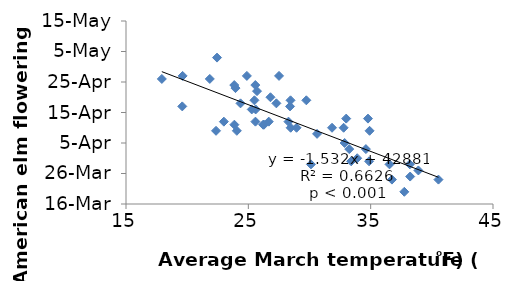
| Category | Series 0 |
|---|---|
| 26.28 | 2017-04-11 |
| 34.61 | 2017-04-03 |
| 22.36 | 2017-04-09 |
| 24.88 | 2017-04-27 |
| 38.23 | 2017-03-25 |
| 40.54 | 2017-03-24 |
| 27.51 | 2017-04-27 |
| 25.58 | 2017-04-12 |
| 28.28 | 2017-04-12 |
| 22.44 | 2017-05-03 |
| 19.63 | 2017-04-27 |
| 24.36 | 2017-04-18 |
| 29.74 | 2017-04-19 |
| 26.67 | 2017-04-12 |
| 24.06 | 2017-04-09 |
| 23.95 | 2017-04-23 |
| 28.45 | 2017-04-19 |
| 30.62 | 2017-04-08 |
| 31.84 | 2017-04-10 |
| 19.6 | 2017-04-17 |
| 33.0 | 2017-04-13 |
| 25.71 | 2017-04-22 |
| 33.9 | 2017-03-31 |
| 25.28 | 2017-04-16 |
| 17.93 | 2017-04-26 |
| 34.78 | 2017-04-13 |
| 28.94 | 2017-04-10 |
| 38.2 | 2017-03-29 |
| 23.0 | 2017-04-12 |
| 23.85 | 2017-04-24 |
| 26.21 | 2017-04-11 |
| 25.57 | 2017-04-24 |
| 38.9 | 2017-03-27 |
| 28.41 | 2017-04-17 |
| 21.85 | 2017-04-26 |
| 30.12 | 2017-03-29 |
| 36.54 | 2017-03-29 |
| 28.46 | 2017-04-10 |
| 26.81 | 2017-04-20 |
| 25.6 | 2017-04-16 |
| 36.74 | 2017-03-24 |
| 27.29 | 2017-04-18 |
| 32.79 | 2017-04-10 |
| 23.86 | 2017-04-11 |
| 34.91 | 2017-04-09 |
| 33.41 | 2017-03-30 |
| 37.75 | 2017-03-20 |
| 32.87 | 2017-04-05 |
| 25.5 | 2017-04-19 |
| 34.87 | 2017-03-30 |
| 33.25 | 2017-04-03 |